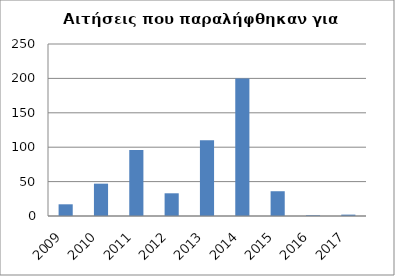
| Category | Series 0 |
|---|---|
| 2009.0 | 17 |
| 2010.0 | 47 |
| 2011.0 | 96 |
| 2012.0 | 33 |
| 2013.0 | 110 |
| 2014.0 | 200 |
| 2015.0 | 36 |
| 2016.0 | 1 |
| 2017.0 | 2 |